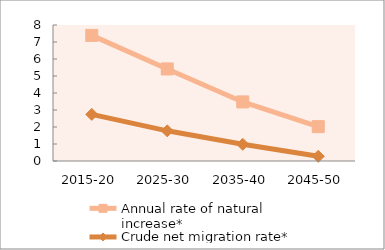
| Category | Annual rate of natural increase* | Crude net migration rate* |
|---|---|---|
| 2015-20 | 7.388 | 2.74 |
| 2025-30 | 5.415 | 1.775 |
| 2035-40 | 3.475 | 0.983 |
| 2045-50 | 2.022 | 0.276 |